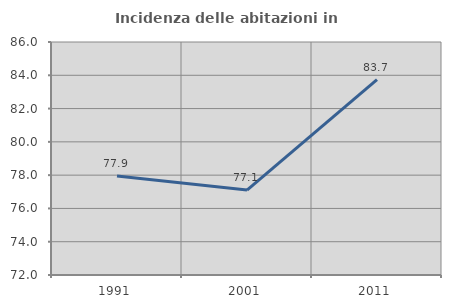
| Category | Incidenza delle abitazioni in proprietà  |
|---|---|
| 1991.0 | 77.944 |
| 2001.0 | 77.1 |
| 2011.0 | 83.741 |